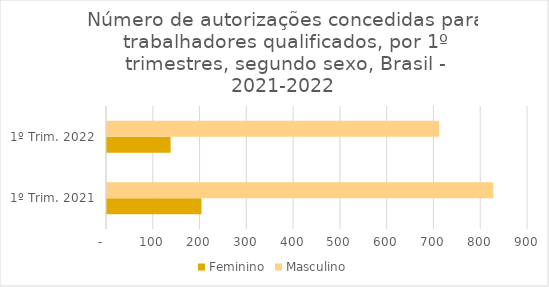
| Category | Feminino | Masculino |
|---|---|---|
| 1º Trim. 2021 | 202 | 826 |
| 1º Trim. 2022 | 136 | 710 |